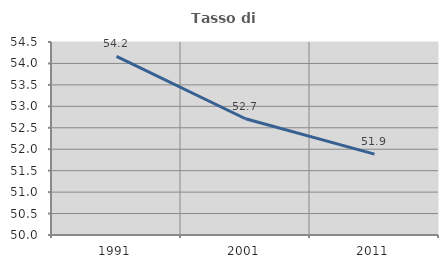
| Category | Tasso di occupazione   |
|---|---|
| 1991.0 | 54.163 |
| 2001.0 | 52.71 |
| 2011.0 | 51.886 |